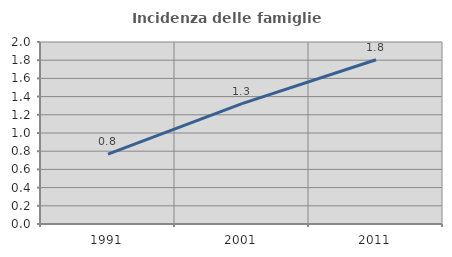
| Category | Incidenza delle famiglie numerose |
|---|---|
| 1991.0 | 0.768 |
| 2001.0 | 1.323 |
| 2011.0 | 1.804 |